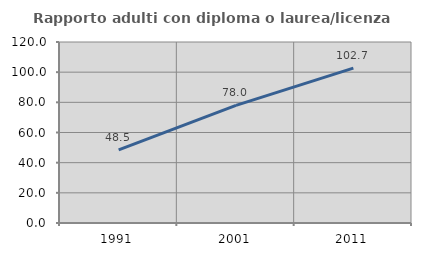
| Category | Rapporto adulti con diploma o laurea/licenza media  |
|---|---|
| 1991.0 | 48.489 |
| 2001.0 | 77.956 |
| 2011.0 | 102.662 |